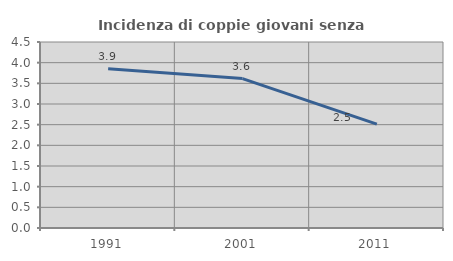
| Category | Incidenza di coppie giovani senza figli |
|---|---|
| 1991.0 | 3.853 |
| 2001.0 | 3.615 |
| 2011.0 | 2.514 |